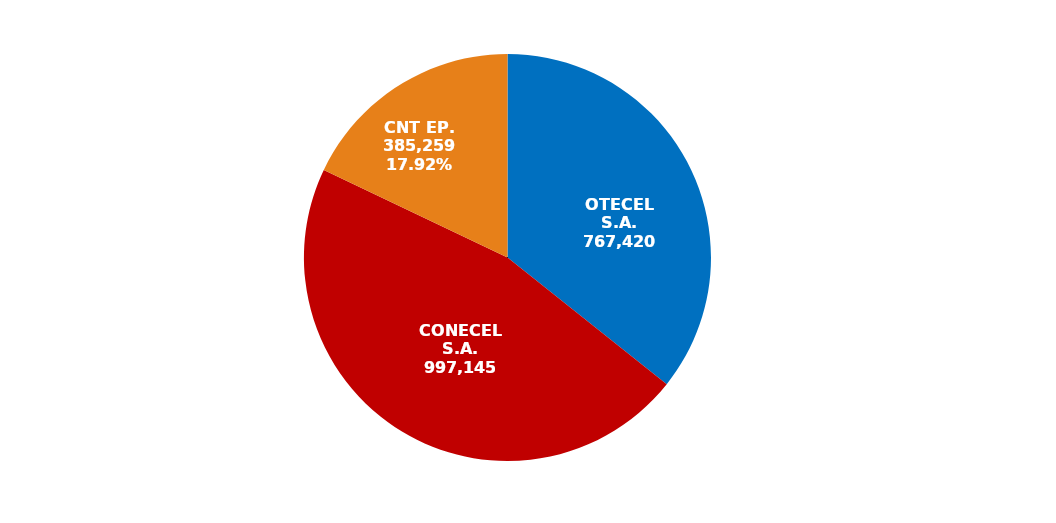
| Category | Series 0 |
|---|---|
| OTECEL S.A. | 767420 |
| CONECEL S.A. | 997145 |
| CNT EP. | 385259 |